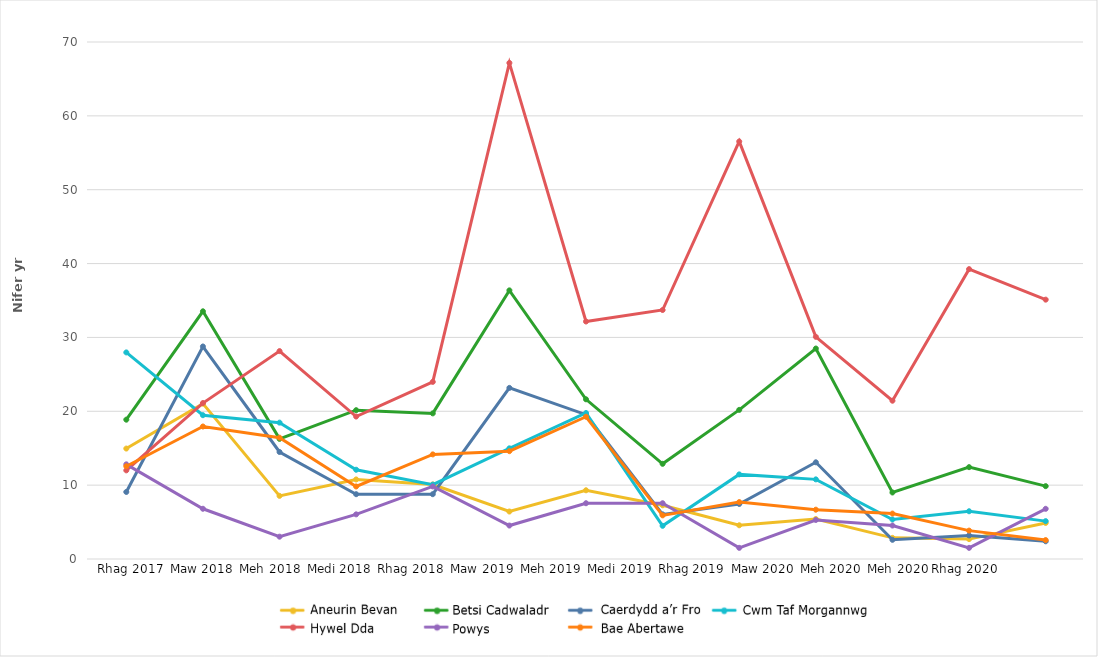
| Category | Aneurin Bevan | Betsi Cadwaladr | Cardiff and Vale | Cwm Taf Morgannwg | Hywel Dda | Powys | Swansea Bay |
|---|---|---|---|---|---|---|---|
| Dec 2017 | 14.954 | 18.863 | 9.077 | 27.971 | 12.003 | 12.816 | 12.56 |
| Mar 2018 | 21.032 | 33.534 | 28.772 | 19.47 | 21.113 | 6.801 | 17.94 |
| Jun 2018 | 8.549 | 16.263 | 14.488 | 18.463 | 28.15 | 3.023 | 16.429 |
| Sep 2018 | 10.772 | 20.149 | 8.774 | 12.085 | 19.288 | 6.045 | 9.82 |
| Dec 2018 | 10.088 | 19.717 | 8.774 | 10.071 | 23.98 | 9.823 | 14.163 |
| Mar 2019 | 6.427 | 36.37 | 23.166 | 14.984 | 67.165 | 4.53 | 14.6 |
| Jun 2019 | 9.303 | 21.622 | 19.54 | 19.767 | 32.156 | 7.55 | 19.262 |
| Sep 2019 | 7.273 | 12.887 | 6.043 | 4.492 | 33.712 | 7.55 | 5.907 |
| Dec 2019 | 4.567 | 20.19 | 7.453 | 11.456 | 56.533 | 1.51 | 7.705 |
| Mar 2020 | 5.412 | 28.495 | 13.094 | 10.782 | 30.082 | 5.285 | 6.677 |
| Jun 2020 | 2.861 | 9.006 | 2.597 | 5.35 | 21.431 | 4.531 | 6.149 |
| Sep 2020 | 2.693 | 12.436 | 3.197 | 6.464 | 39.248 | 1.51 | 3.843 |
| Dec 2020 | 4.881 | 9.863 | 2.398 | 5.127 | 35.116 | 6.796 | 2.562 |